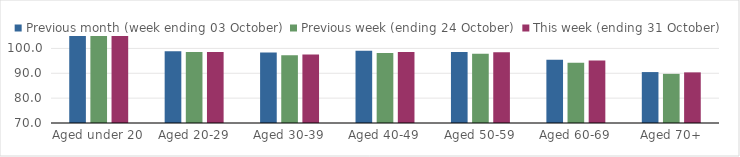
| Category | Previous month (week ending 03 October) | Previous week (ending 24 October) | This week (ending 31 October) |
|---|---|---|---|
| Aged under 20 | 106.57 | 109.73 | 111.27 |
| Aged 20-29 | 98.89 | 98.61 | 98.53 |
| Aged 30-39 | 98.34 | 97.3 | 97.59 |
| Aged 40-49 | 99.06 | 98.13 | 98.59 |
| Aged 50-59 | 98.61 | 97.83 | 98.43 |
| Aged 60-69 | 95.46 | 94.27 | 95.13 |
| Aged 70+ | 90.49 | 89.77 | 90.37 |